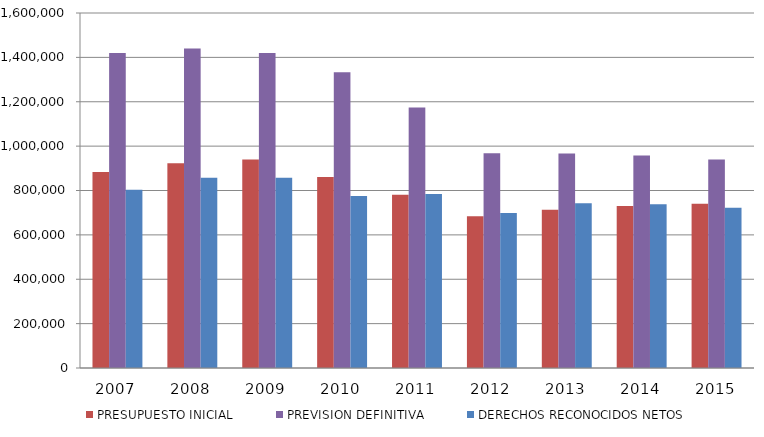
| Category | PRESUPUESTO INICIAL | PREVISION DEFINITIVA | DERECHOS RECONOCIDOS NETOS |
|---|---|---|---|
| 2007.0 | 882898.804 | 1419429.16 | 803937.7 |
| 2008.0 | 922294.818 | 1440370.09 | 857449.79 |
| 2009.0 | 939676.058 | 1419362.46 | 857886.21 |
| 2010.0 | 861041.347 | 1333155.925 | 774982.94 |
| 2011.0 | 780284.157 | 1174035.807 | 783705.016 |
| 2012.0 | 684435.746 | 968306.758 | 698264.246 |
| 2013.0 | 713002.158 | 967155.817 | 742940.524 |
| 2014.0 | 729663.12 | 958102.457 | 737702.75 |
| 2015.0 | 740573.085 | 939368.212 | 722456.445 |